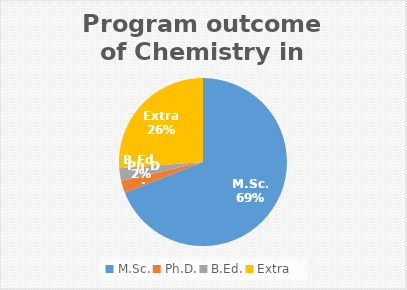
| Category | Series 0 |
|---|---|
| M.Sc. | 29 |
| Ph.D. | 1 |
| B.Ed. | 1 |
| Extra | 11 |